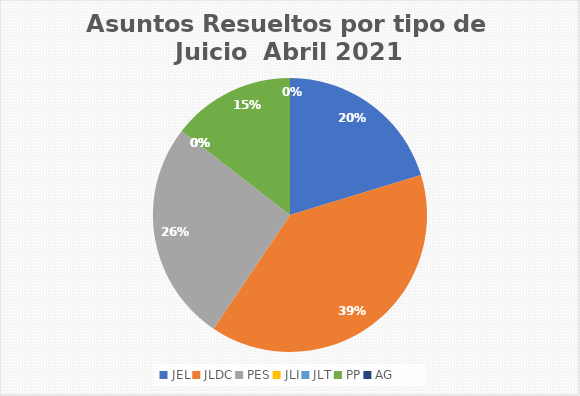
| Category | Asuntos Resueltos por tipo de Juicio  Abril |
|---|---|
| JEL | 14 |
| JLDC | 27 |
| PES | 18 |
| JLI | 0 |
| JLT | 0 |
| PP | 10 |
| AG | 0 |